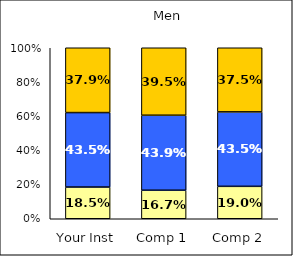
| Category | Low Pluralistic Orientation | Average Pluralistic Orientation | High Pluralistic Orientation |
|---|---|---|---|
| Your Inst | 0.185 | 0.435 | 0.379 |
| Comp 1 | 0.167 | 0.439 | 0.395 |
| Comp 2 | 0.19 | 0.435 | 0.375 |